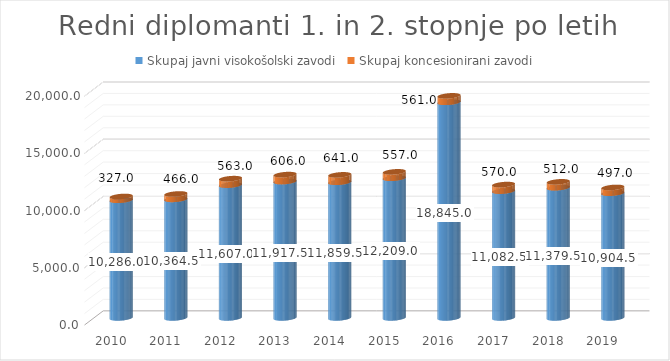
| Category | Skupaj javni visokošolski zavodi | Skupaj koncesionirani zavodi |
|---|---|---|
| 2010.0 | 10286 | 327 |
| 2011.0 | 10364.5 | 466 |
| 2012.0 | 11607 | 563 |
| 2013.0 | 11917.5 | 606 |
| 2014.0 | 11859.5 | 641 |
| 2015.0 | 12209 | 557 |
| 2016.0 | 18845 | 561 |
| 2017.0 | 11082.5 | 570 |
| 2018.0 | 11379.5 | 512 |
| 2019.0 | 10904.5 | 497 |